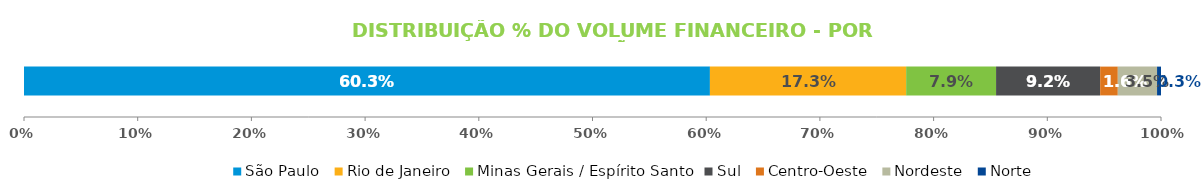
| Category | São Paulo | Rio de Janeiro | Minas Gerais / Espírito Santo | Sul | Centro-Oeste | Nordeste | Norte |
|---|---|---|---|---|---|---|---|
| 0 | 0.603 | 0.173 | 0.079 | 0.092 | 0.016 | 0.035 | 0.003 |